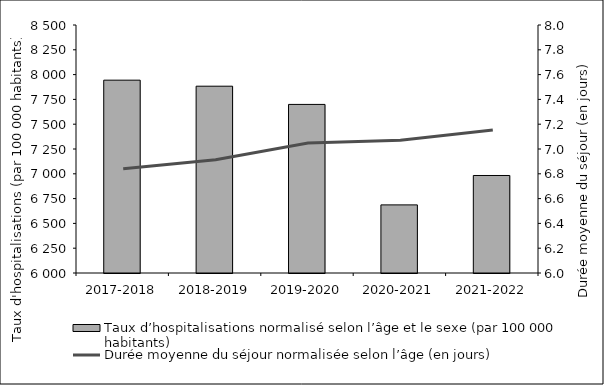
| Category | Taux d’hospitalisations normalisé selon l’âge et le sexe (par 100 000 habitants) |
|---|---|
| 2017-2018 | 7943.875 |
| 2018-2019 | 7883.11 |
| 2019-2020 | 7699.481 |
| 2020-2021 | 6686.675 |
| 2021-2022 | 6982.958 |